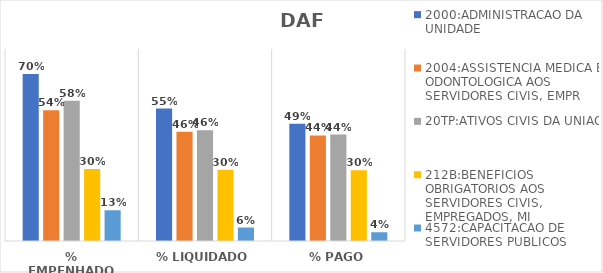
| Category | 2000:ADMINISTRACAO DA UNIDADE | 2004:ASSISTENCIA MEDICA E ODONTOLOGICA AOS SERVIDORES CIVIS, EMPR | 20TP:ATIVOS CIVIS DA UNIAO | 212B:BENEFICIOS OBRIGATORIOS AOS SERVIDORES CIVIS, EMPREGADOS, MI | 4572:CAPACITACAO DE SERVIDORES PUBLICOS FEDERAIS EM PROCESSO DE Q |
|---|---|---|---|---|---|
| % EMPENHADO | 0.696 | 0.544 | 0.584 | 0.3 | 0.128 |
| % LIQUIDADO | 0.552 | 0.456 | 0.462 | 0.297 | 0.056 |
| % PAGO | 0.489 | 0.44 | 0.444 | 0.295 | 0.037 |